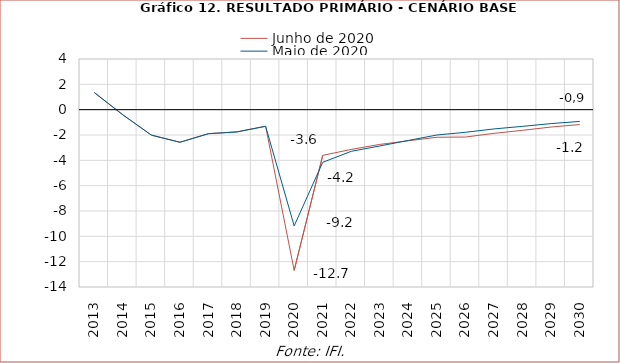
| Category | Junho de 2020 | Maio de 2020 |
|---|---|---|
| 2013.0 | 1.353 | 1.353 |
| 2014.0 | -0.406 | -0.406 |
| 2015.0 | -2.01 | -2.01 |
| 2016.0 | -2.573 | -2.573 |
| 2017.0 | -1.896 | -1.896 |
| 2018.0 | -1.745 | -1.761 |
| 2019.0 | -1.309 | -1.31 |
| 2020.0 | -12.689 | -9.176 |
| 2021.0 | -3.609 | -4.157 |
| 2022.0 | -3.136 | -3.287 |
| 2023.0 | -2.742 | -2.866 |
| 2024.0 | -2.456 | -2.428 |
| 2025.0 | -2.178 | -2.001 |
| 2026.0 | -2.161 | -1.785 |
| 2027.0 | -1.87 | -1.519 |
| 2028.0 | -1.631 | -1.317 |
| 2029.0 | -1.37 | -1.099 |
| 2030.0 | -1.172 | -0.929 |